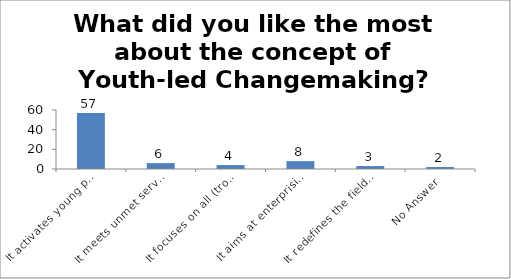
| Category | What did you like the most about the concept of Youth-led Changemaking? |
|---|---|
| It activates young people as Changemakers | 57 |
| It meets unmet service needs of the Society | 6 |
| It focuses on all (troubled and prepared) young people | 4 |
| It aims at enterprising education | 8 |
| It redefines the field of youth development | 3 |
| No Answer | 2 |